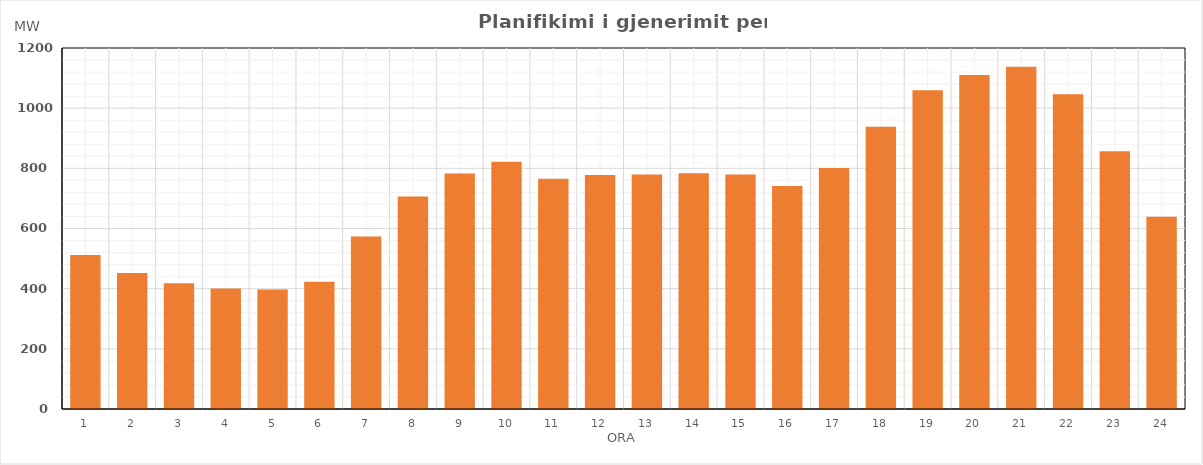
| Category | Max (MW) |
|---|---|
| 0 | 511.69 |
| 1 | 451.88 |
| 2 | 417.79 |
| 3 | 400.88 |
| 4 | 397.26 |
| 5 | 423.16 |
| 6 | 573.12 |
| 7 | 705.98 |
| 8 | 782.89 |
| 9 | 821.64 |
| 10 | 765.03 |
| 11 | 778.15 |
| 12 | 779.26 |
| 13 | 783.97 |
| 14 | 779.56 |
| 15 | 741.47 |
| 16 | 801.36 |
| 17 | 938.36 |
| 18 | 1059.45 |
| 19 | 1109.9 |
| 20 | 1137.91 |
| 21 | 1046.42 |
| 22 | 856.44 |
| 23 | 639.28 |